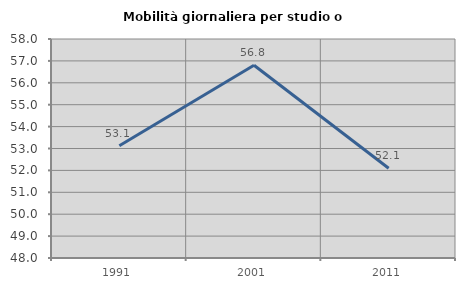
| Category | Mobilità giornaliera per studio o lavoro |
|---|---|
| 1991.0 | 53.125 |
| 2001.0 | 56.803 |
| 2011.0 | 52.098 |